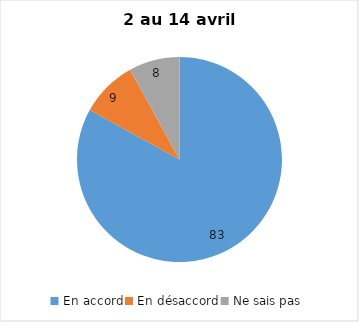
| Category | Series 0 |
|---|---|
| En accord | 83 |
| En désaccord | 9 |
| Ne sais pas | 8 |